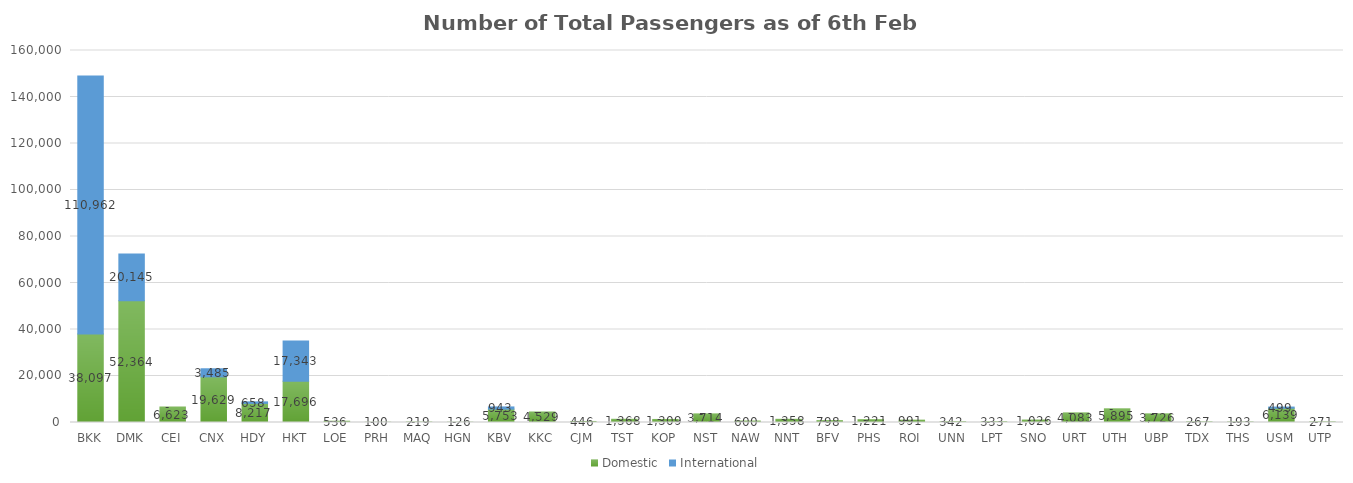
| Category | Domestic | International |
|---|---|---|
| BKK | 38097 | 110962 |
| DMK | 52364 | 20145 |
| CEI | 6623 | 0 |
| CNX | 19629 | 3485 |
| HDY | 8217 | 658 |
| HKT | 17696 | 17343 |
| LOE | 536 | 0 |
| PRH | 100 | 0 |
| MAQ | 219 | 0 |
| HGN | 126 | 0 |
| KBV | 5753 | 943 |
| KKC | 4529 | 0 |
| CJM | 446 | 0 |
| TST | 1368 | 0 |
| KOP | 1309 | 0 |
| NST | 3714 | 0 |
| NAW | 600 | 0 |
| NNT | 1358 | 0 |
| BFV | 798 | 0 |
| PHS | 1221 | 0 |
| ROI | 991 | 0 |
| UNN | 342 | 0 |
| LPT | 333 | 0 |
| SNO | 1026 | 0 |
| URT | 4083 | 0 |
| UTH | 5895 | 0 |
| UBP | 3726 | 0 |
| TDX | 267 | 0 |
| THS | 193 | 0 |
| USM | 6139 | 499 |
| UTP | 271 | 0 |